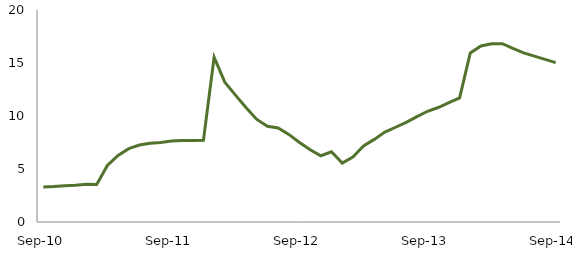
| Category | Series 0 |
|---|---|
| Sep-10 | 3.296 |
|  | 3.347 |
|  | 3.43 |
|  | 3.472 |
|  | 3.551 |
|  | 3.547 |
|  | 5.335 |
|  | 6.272 |
|  | 6.917 |
|  | 7.265 |
|  | 7.425 |
|  | 7.496 |
| Sep-11 | 7.639 |
|  | 7.691 |
|  | 7.692 |
|  | 7.708 |
|  | 15.54 |
|  | 13.188 |
|  | 11.966 |
|  | 10.775 |
|  | 9.674 |
|  | 9.035 |
|  | 8.864 |
|  | 8.265 |
| Sep-12 | 7.496 |
|  | 6.818 |
|  | 6.25 |
|  | 6.627 |
|  | 5.561 |
|  | 6.138 |
|  | 7.165 |
|  | 7.793 |
|  | 8.48 |
|  | 8.939 |
|  | 9.399 |
|  | 9.944 |
| Sep-13 | 10.447 |
|  | 10.799 |
|  | 11.252 |
|  | 11.714 |
|  | 15.952 |
|  | 16.607 |
|  | 16.821 |
|  | 16.817 |
|  | 16.37 |
|  | 15.96 |
|  | 15.645 |
|  | 15.343 |
| Sep-14 | 15.031 |